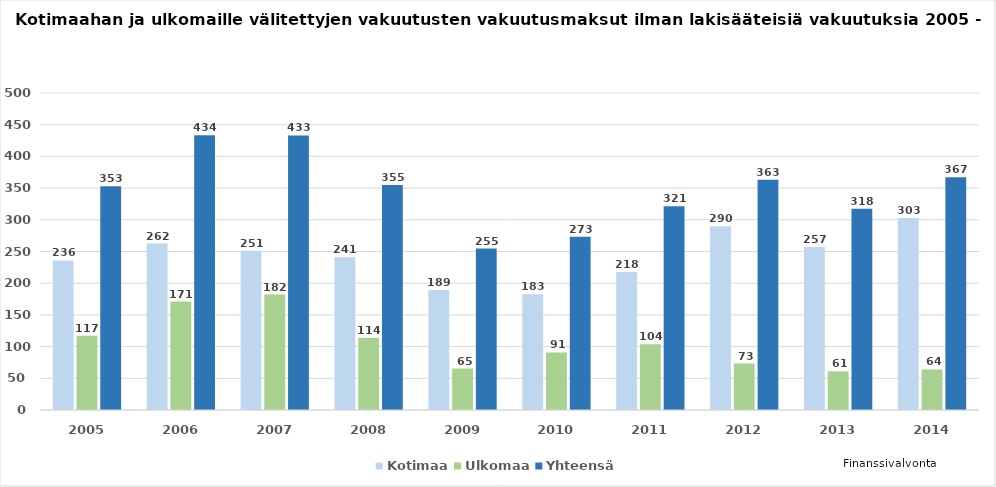
| Category | Kotimaa | Ulkomaa | Yhteensä  |
|---|---|---|---|
| 2005.0 | 236 | 117 | 353 |
| 2006.0 | 262.471 | 171.056 | 433.526 |
| 2007.0 | 251 | 182 | 433 |
| 2008.0 | 241 | 114 | 355 |
| 2009.0 | 189.249 | 65.417 | 254.666 |
| 2010.0 | 182.562 | 90.729 | 273.291 |
| 2011.0 | 217.55 | 103.894 | 321.444 |
| 2012.0 | 289.922 | 73.321 | 363.243 |
| 2013.0 | 257 | 61 | 317.523 |
| 2014.0 | 303 | 64 | 367 |